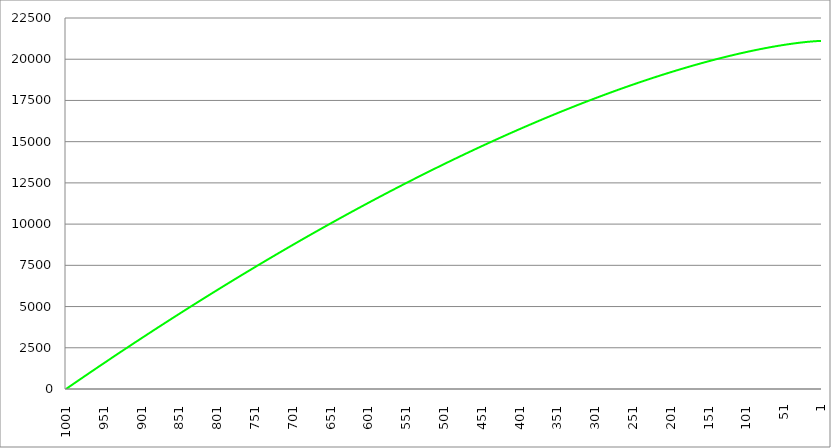
| Category | Series 1 | Series 0 | Series 2 |
|---|---|---|---|
| 1001.0 |  | 0 |  |
| 1000.5 |  | 15.817 |  |
| 1000.0 |  | 31.631 |  |
| 999.5 |  | 47.44 |  |
| 999.0 |  | 63.246 |  |
| 998.5 |  | 79.047 |  |
| 998.0 |  | 94.845 |  |
| 997.5 |  | 110.638 |  |
| 997.0 |  | 126.428 |  |
| 996.5 |  | 142.213 |  |
| 996.0 |  | 157.995 |  |
| 995.5 |  | 173.773 |  |
| 995.0 |  | 189.547 |  |
| 994.5 |  | 205.317 |  |
| 994.0 |  | 221.082 |  |
| 993.5 |  | 236.844 |  |
| 993.0 |  | 252.602 |  |
| 992.5 |  | 268.356 |  |
| 992.0 |  | 284.106 |  |
| 991.5 |  | 299.852 |  |
| 991.0 |  | 315.594 |  |
| 990.5 |  | 331.332 |  |
| 990.0 |  | 347.067 |  |
| 989.5 |  | 362.797 |  |
| 989.0 |  | 378.523 |  |
| 988.5 |  | 394.245 |  |
| 988.0 |  | 409.963 |  |
| 987.5 |  | 425.678 |  |
| 987.0 |  | 441.388 |  |
| 986.5 |  | 457.094 |  |
| 986.0 |  | 472.796 |  |
| 985.5 |  | 488.495 |  |
| 985.0 |  | 504.189 |  |
| 984.5 |  | 519.879 |  |
| 984.0 |  | 535.566 |  |
| 983.5 |  | 551.248 |  |
| 983.0 |  | 566.927 |  |
| 982.5 |  | 582.601 |  |
| 982.0 |  | 598.271 |  |
| 981.5 |  | 613.938 |  |
| 981.0 |  | 629.6 |  |
| 980.5 |  | 645.259 |  |
| 980.0 |  | 660.913 |  |
| 979.5 |  | 676.564 |  |
| 979.0 |  | 692.21 |  |
| 978.5 |  | 707.853 |  |
| 978.0 |  | 723.491 |  |
| 977.5 |  | 739.126 |  |
| 977.0 |  | 754.756 |  |
| 976.5 |  | 770.383 |  |
| 976.0 |  | 786.005 |  |
| 975.5 |  | 801.624 |  |
| 975.0 |  | 817.238 |  |
| 974.5 |  | 832.849 |  |
| 974.0 |  | 848.455 |  |
| 973.5 |  | 864.058 |  |
| 973.0 |  | 879.656 |  |
| 972.5 |  | 895.251 |  |
| 972.0 |  | 910.841 |  |
| 971.5 |  | 926.428 |  |
| 971.0 |  | 942.01 |  |
| 970.5 |  | 957.588 |  |
| 970.0 |  | 973.163 |  |
| 969.5 |  | 988.733 |  |
| 969.0 |  | 1004.3 |  |
| 968.5 |  | 1019.862 |  |
| 968.0 |  | 1035.42 |  |
| 967.5 |  | 1050.975 |  |
| 967.0 |  | 1066.525 |  |
| 966.5 |  | 1082.071 |  |
| 966.0 |  | 1097.614 |  |
| 965.5 |  | 1113.152 |  |
| 965.0 |  | 1128.686 |  |
| 964.5 |  | 1144.216 |  |
| 964.0 |  | 1159.743 |  |
| 963.5 |  | 1175.265 |  |
| 963.0 |  | 1190.783 |  |
| 962.5 |  | 1206.297 |  |
| 962.0 |  | 1221.807 |  |
| 961.5 |  | 1237.313 |  |
| 961.0 |  | 1252.815 |  |
| 960.5 |  | 1268.313 |  |
| 960.0 |  | 1283.807 |  |
| 959.5 |  | 1299.297 |  |
| 959.0 |  | 1314.783 |  |
| 958.5 |  | 1330.265 |  |
| 958.0 |  | 1345.742 |  |
| 957.5 |  | 1361.216 |  |
| 957.0 |  | 1376.686 |  |
| 956.5 |  | 1392.152 |  |
| 956.0 |  | 1407.613 |  |
| 955.5 |  | 1423.071 |  |
| 955.0 |  | 1438.524 |  |
| 954.5 |  | 1453.974 |  |
| 954.0 |  | 1469.419 |  |
| 953.5 |  | 1484.861 |  |
| 953.0 |  | 1500.298 |  |
| 952.5 |  | 1515.732 |  |
| 952.0 |  | 1531.161 |  |
| 951.5 |  | 1546.586 |  |
| 951.0 |  | 1562.007 |  |
| 950.5 |  | 1577.424 |  |
| 950.0 |  | 1592.837 |  |
| 949.5 |  | 1608.246 |  |
| 949.0 |  | 1623.651 |  |
| 948.5 |  | 1639.052 |  |
| 948.0 |  | 1654.449 |  |
| 947.5 |  | 1669.842 |  |
| 947.0 |  | 1685.231 |  |
| 946.5 |  | 1700.615 |  |
| 946.0 |  | 1715.996 |  |
| 945.5 |  | 1731.372 |  |
| 945.0 |  | 1746.745 |  |
| 944.5 |  | 1762.113 |  |
| 944.0 |  | 1777.478 |  |
| 943.5 |  | 1792.838 |  |
| 943.0 |  | 1808.194 |  |
| 942.5 |  | 1823.546 |  |
| 942.0 |  | 1838.894 |  |
| 941.5 |  | 1854.238 |  |
| 941.0 |  | 1869.578 |  |
| 940.5 |  | 1884.914 |  |
| 940.0 |  | 1900.246 |  |
| 939.5 |  | 1915.573 |  |
| 939.0 |  | 1930.897 |  |
| 938.5 |  | 1946.216 |  |
| 938.0 |  | 1961.532 |  |
| 937.5 |  | 1976.843 |  |
| 937.0 |  | 1992.15 |  |
| 936.5 |  | 2007.454 |  |
| 936.0 |  | 2022.753 |  |
| 935.5 |  | 2038.048 |  |
| 935.0 |  | 2053.339 |  |
| 934.5 |  | 2068.625 |  |
| 934.0 |  | 2083.908 |  |
| 933.5 |  | 2099.187 |  |
| 933.0 |  | 2114.461 |  |
| 932.5 |  | 2129.732 |  |
| 932.0 |  | 2144.998 |  |
| 931.5 |  | 2160.261 |  |
| 931.0 |  | 2175.519 |  |
| 930.5 |  | 2190.773 |  |
| 930.0 |  | 2206.023 |  |
| 929.5 |  | 2221.269 |  |
| 929.0 |  | 2236.511 |  |
| 928.5 |  | 2251.748 |  |
| 928.0 |  | 2266.982 |  |
| 927.5 |  | 2282.211 |  |
| 927.0 |  | 2297.437 |  |
| 926.5 |  | 2312.658 |  |
| 926.0 |  | 2327.875 |  |
| 925.5 |  | 2343.088 |  |
| 925.0 |  | 2358.297 |  |
| 924.5 |  | 2373.502 |  |
| 924.0 |  | 2388.703 |  |
| 923.5 |  | 2403.899 |  |
| 923.0 |  | 2419.092 |  |
| 922.5 |  | 2434.28 |  |
| 922.0 |  | 2449.465 |  |
| 921.5 |  | 2464.645 |  |
| 921.0 |  | 2479.821 |  |
| 920.5 |  | 2494.993 |  |
| 920.0 |  | 2510.161 |  |
| 919.5 |  | 2525.324 |  |
| 919.0 |  | 2540.484 |  |
| 918.5 |  | 2555.639 |  |
| 918.0 |  | 2570.791 |  |
| 917.5 |  | 2585.938 |  |
| 917.0 |  | 2601.081 |  |
| 916.5 |  | 2616.22 |  |
| 916.0 |  | 2631.355 |  |
| 915.5 |  | 2646.485 |  |
| 915.0 |  | 2661.612 |  |
| 914.5 |  | 2676.734 |  |
| 914.0 |  | 2691.853 |  |
| 913.5 |  | 2706.967 |  |
| 913.0 |  | 2722.077 |  |
| 912.5 |  | 2737.183 |  |
| 912.0 |  | 2752.284 |  |
| 911.5 |  | 2767.382 |  |
| 911.0 |  | 2782.475 |  |
| 910.5 |  | 2797.565 |  |
| 910.0 |  | 2812.65 |  |
| 909.5 |  | 2827.731 |  |
| 909.0 |  | 2842.808 |  |
| 908.5 |  | 2857.881 |  |
| 908.0 |  | 2872.949 |  |
| 907.5 |  | 2888.014 |  |
| 907.0 |  | 2903.074 |  |
| 906.5 |  | 2918.13 |  |
| 906.0 |  | 2933.182 |  |
| 905.5 |  | 2948.23 |  |
| 905.0 |  | 2963.274 |  |
| 904.5 |  | 2978.313 |  |
| 904.0 |  | 2993.349 |  |
| 903.5 |  | 3008.38 |  |
| 903.0 |  | 3023.407 |  |
| 902.5 |  | 3038.43 |  |
| 902.0 |  | 3053.448 |  |
| 901.5 |  | 3068.463 |  |
| 901.0 |  | 3083.473 |  |
| 900.5 |  | 3098.48 |  |
| 900.0 |  | 3113.482 |  |
| 899.5 |  | 3128.48 |  |
| 899.0 |  | 3143.473 |  |
| 898.5 |  | 3158.463 |  |
| 898.0 |  | 3173.448 |  |
| 897.5 |  | 3188.43 |  |
| 897.0 |  | 3203.407 |  |
| 896.5 |  | 3218.38 |  |
| 896.0 |  | 3233.348 |  |
| 895.5 |  | 3248.313 |  |
| 895.0 |  | 3263.273 |  |
| 894.5 |  | 3278.229 |  |
| 894.0 |  | 3293.181 |  |
| 893.5 |  | 3308.129 |  |
| 893.0 |  | 3323.073 |  |
| 892.5 |  | 3338.012 |  |
| 892.0 |  | 3352.948 |  |
| 891.5 |  | 3367.879 |  |
| 891.0 |  | 3382.806 |  |
| 890.5 |  | 3397.728 |  |
| 890.0 |  | 3412.647 |  |
| 889.5 |  | 3427.561 |  |
| 889.0 |  | 3442.471 |  |
| 888.5 |  | 3457.377 |  |
| 888.0 |  | 3472.279 |  |
| 887.5 |  | 3487.177 |  |
| 887.0 |  | 3502.07 |  |
| 886.5 |  | 3516.959 |  |
| 886.0 |  | 3531.844 |  |
| 885.5 |  | 3546.725 |  |
| 885.0 |  | 3561.602 |  |
| 884.5 |  | 3576.474 |  |
| 884.0 |  | 3591.342 |  |
| 883.5 |  | 3606.206 |  |
| 883.0 |  | 3621.066 |  |
| 882.5 |  | 3635.921 |  |
| 882.0 |  | 3650.773 |  |
| 881.5 |  | 3665.62 |  |
| 881.0 |  | 3680.463 |  |
| 880.5 |  | 3695.301 |  |
| 880.0 |  | 3710.136 |  |
| 879.5 |  | 3724.966 |  |
| 879.0 |  | 3739.792 |  |
| 878.5 |  | 3754.614 |  |
| 878.0 |  | 3769.432 |  |
| 877.5 |  | 3784.245 |  |
| 877.0 |  | 3799.054 |  |
| 876.5 |  | 3813.859 |  |
| 876.0 |  | 3828.66 |  |
| 875.5 |  | 3843.457 |  |
| 875.0 |  | 3858.249 |  |
| 874.5 |  | 3873.037 |  |
| 874.0 |  | 3887.821 |  |
| 873.5 |  | 3902.601 |  |
| 873.0 |  | 3917.376 |  |
| 872.5 |  | 3932.147 |  |
| 872.0 |  | 3946.914 |  |
| 871.5 |  | 3961.677 |  |
| 871.0 |  | 3976.435 |  |
| 870.5 |  | 3991.19 |  |
| 870.0 |  | 4005.94 |  |
| 869.5 |  | 4020.685 |  |
| 869.0 |  | 4035.427 |  |
| 868.5 |  | 4050.164 |  |
| 868.0 |  | 4064.897 |  |
| 867.5 |  | 4079.626 |  |
| 867.0 |  | 4094.351 |  |
| 866.5 |  | 4109.071 |  |
| 866.0 |  | 4123.787 |  |
| 865.5 |  | 4138.499 |  |
| 865.0 |  | 4153.206 |  |
| 864.5 |  | 4167.91 |  |
| 864.0 |  | 4182.609 |  |
| 863.5 |  | 4197.303 |  |
| 863.0 |  | 4211.994 |  |
| 862.5 |  | 4226.68 |  |
| 862.0 |  | 4241.362 |  |
| 861.5 |  | 4256.04 |  |
| 861.0 |  | 4270.714 |  |
| 860.5 |  | 4285.383 |  |
| 860.0 |  | 4300.048 |  |
| 859.5 |  | 4314.709 |  |
| 859.0 |  | 4329.365 |  |
| 858.5 |  | 4344.017 |  |
| 858.0 |  | 4358.665 |  |
| 857.5 |  | 4373.309 |  |
| 857.0 |  | 4387.948 |  |
| 856.5 |  | 4402.584 |  |
| 856.0 |  | 4417.214 |  |
| 855.5 |  | 4431.841 |  |
| 855.0 |  | 4446.463 |  |
| 854.5 |  | 4461.081 |  |
| 854.0 |  | 4475.695 |  |
| 853.5 |  | 4490.305 |  |
| 853.0 |  | 4504.91 |  |
| 852.5 |  | 4519.511 |  |
| 852.0 |  | 4534.108 |  |
| 851.5 |  | 4548.7 |  |
| 851.0 |  | 4563.288 |  |
| 850.5 |  | 4577.872 |  |
| 850.0 |  | 4592.451 |  |
| 849.5 |  | 4607.027 |  |
| 849.0 |  | 4621.598 |  |
| 848.5 |  | 4636.164 |  |
| 848.0 |  | 4650.727 |  |
| 847.5 |  | 4665.285 |  |
| 847.0 |  | 4679.838 |  |
| 846.5 |  | 4694.388 |  |
| 846.0 |  | 4708.933 |  |
| 845.5 |  | 4723.474 |  |
| 845.0 |  | 4738.011 |  |
| 844.5 |  | 4752.543 |  |
| 844.0 |  | 4767.071 |  |
| 843.5 |  | 4781.595 |  |
| 843.0 |  | 4796.114 |  |
| 842.5 |  | 4810.629 |  |
| 842.0 |  | 4825.14 |  |
| 841.5 |  | 4839.646 |  |
| 841.0 |  | 4854.148 |  |
| 840.5 |  | 4868.646 |  |
| 840.0 |  | 4883.14 |  |
| 839.5 |  | 4897.629 |  |
| 839.0 |  | 4912.114 |  |
| 838.5 |  | 4926.595 |  |
| 838.0 |  | 4941.071 |  |
| 837.5 |  | 4955.543 |  |
| 837.0 |  | 4970.01 |  |
| 836.5 |  | 4984.474 |  |
| 836.0 |  | 4998.933 |  |
| 835.5 |  | 5013.387 |  |
| 835.0 |  | 5027.838 |  |
| 834.5 |  | 5042.284 |  |
| 834.0 |  | 5056.725 |  |
| 833.5 |  | 5071.163 |  |
| 833.0 |  | 5085.596 |  |
| 832.5 |  | 5100.025 |  |
| 832.0 |  | 5114.449 |  |
| 831.5 |  | 5128.869 |  |
| 831.0 |  | 5143.285 |  |
| 830.5 |  | 5157.696 |  |
| 830.0 |  | 5172.103 |  |
| 829.5 |  | 5186.506 |  |
| 829.0 |  | 5200.904 |  |
| 828.5 |  | 5215.298 |  |
| 828.0 |  | 5229.688 |  |
| 827.5 |  | 5244.073 |  |
| 827.0 |  | 5258.454 |  |
| 826.5 |  | 5272.831 |  |
| 826.0 |  | 5287.203 |  |
| 825.5 |  | 5301.571 |  |
| 825.0 |  | 5315.934 |  |
| 824.5 |  | 5330.294 |  |
| 824.0 |  | 5344.649 |  |
| 823.5 |  | 5358.999 |  |
| 823.0 |  | 5373.345 |  |
| 822.5 |  | 5387.687 |  |
| 822.0 |  | 5402.025 |  |
| 821.5 |  | 5416.358 |  |
| 821.0 |  | 5430.686 |  |
| 820.5 |  | 5445.011 |  |
| 820.0 |  | 5459.331 |  |
| 819.5 |  | 5473.646 |  |
| 819.0 |  | 5487.958 |  |
| 818.5 |  | 5502.265 |  |
| 818.0 |  | 5516.567 |  |
| 817.5 |  | 5530.865 |  |
| 817.0 |  | 5545.159 |  |
| 816.5 |  | 5559.448 |  |
| 816.0 |  | 5573.733 |  |
| 815.5 |  | 5588.014 |  |
| 815.0 |  | 5602.29 |  |
| 814.5 |  | 5616.562 |  |
| 814.0 |  | 5630.83 |  |
| 813.5 |  | 5645.093 |  |
| 813.0 |  | 5659.352 |  |
| 812.5 |  | 5673.606 |  |
| 812.0 |  | 5687.856 |  |
| 811.5 |  | 5702.102 |  |
| 811.0 |  | 5716.343 |  |
| 810.5 |  | 5730.58 |  |
| 810.0 |  | 5744.812 |  |
| 809.5 |  | 5759.04 |  |
| 809.0 |  | 5773.264 |  |
| 808.5 |  | 5787.483 |  |
| 808.0 |  | 5801.698 |  |
| 807.5 |  | 5815.909 |  |
| 807.0 |  | 5830.115 |  |
| 806.5 |  | 5844.316 |  |
| 806.0 |  | 5858.514 |  |
| 805.5 |  | 5872.707 |  |
| 805.0 |  | 5886.895 |  |
| 804.5 |  | 5901.079 |  |
| 804.0 |  | 5915.259 |  |
| 803.5 |  | 5929.434 |  |
| 803.0 |  | 5943.605 |  |
| 802.5 |  | 5957.771 |  |
| 802.0 |  | 5971.933 |  |
| 801.5 |  | 5986.091 |  |
| 801.0 |  | 6000.244 |  |
| 800.5 |  | 6014.393 |  |
| 800.0 |  | 6028.537 |  |
| 799.5 |  | 6042.677 |  |
| 799.0 |  | 6056.813 |  |
| 798.5 |  | 6070.944 |  |
| 798.0 |  | 6085.07 |  |
| 797.5 |  | 6099.192 |  |
| 797.0 |  | 6113.31 |  |
| 796.5 |  | 6127.424 |  |
| 796.0 |  | 6141.533 |  |
| 795.5 |  | 6155.637 |  |
| 795.0 |  | 6169.737 |  |
| 794.5 |  | 6183.833 |  |
| 794.0 |  | 6197.924 |  |
| 793.5 |  | 6212.011 |  |
| 793.0 |  | 6226.093 |  |
| 792.5 |  | 6240.171 |  |
| 792.0 |  | 6254.245 |  |
| 791.5 |  | 6268.314 |  |
| 791.0 |  | 6282.378 |  |
| 790.5 |  | 6296.438 |  |
| 790.0 |  | 6310.494 |  |
| 789.5 |  | 6324.545 |  |
| 789.0 |  | 6338.592 |  |
| 788.5 |  | 6352.634 |  |
| 788.0 |  | 6366.672 |  |
| 787.5 |  | 6380.706 |  |
| 787.0 |  | 6394.735 |  |
| 786.5 |  | 6408.759 |  |
| 786.0 |  | 6422.779 |  |
| 785.5 |  | 6436.795 |  |
| 785.0 |  | 6450.806 |  |
| 784.5 |  | 6464.813 |  |
| 784.0 |  | 6478.815 |  |
| 783.5 |  | 6492.813 |  |
| 783.0 |  | 6506.806 |  |
| 782.5 |  | 6520.795 |  |
| 782.0 |  | 6534.779 |  |
| 781.5 |  | 6548.759 |  |
| 781.0 |  | 6562.735 |  |
| 780.5 |  | 6576.706 |  |
| 780.0 |  | 6590.672 |  |
| 779.5 |  | 6604.634 |  |
| 779.0 |  | 6618.592 |  |
| 778.5 |  | 6632.545 |  |
| 778.0 |  | 6646.493 |  |
| 777.5 |  | 6660.437 |  |
| 777.0 |  | 6674.377 |  |
| 776.5 |  | 6688.312 |  |
| 776.0 |  | 6702.243 |  |
| 775.5 |  | 6716.169 |  |
| 775.0 |  | 6730.09 |  |
| 774.5 |  | 6744.008 |  |
| 774.0 |  | 6757.92 |  |
| 773.5 |  | 6771.828 |  |
| 773.0 |  | 6785.732 |  |
| 772.5 |  | 6799.631 |  |
| 772.0 |  | 6813.526 |  |
| 771.5 |  | 6827.416 |  |
| 771.0 |  | 6841.302 |  |
| 770.5 |  | 6855.183 |  |
| 770.0 |  | 6869.06 |  |
| 769.5 |  | 6882.932 |  |
| 769.0 |  | 6896.8 |  |
| 768.5 |  | 6910.663 |  |
| 768.0 |  | 6924.522 |  |
| 767.5 |  | 6938.376 |  |
| 767.0 |  | 6952.225 |  |
| 766.5 |  | 6966.07 |  |
| 766.0 |  | 6979.911 |  |
| 765.5 |  | 6993.747 |  |
| 765.0 |  | 7007.579 |  |
| 764.5 |  | 7021.406 |  |
| 764.0 |  | 7035.228 |  |
| 763.5 |  | 7049.046 |  |
| 763.0 |  | 7062.86 |  |
| 762.5 |  | 7076.669 |  |
| 762.0 |  | 7090.473 |  |
| 761.5 |  | 7104.273 |  |
| 761.0 |  | 7118.069 |  |
| 760.5 |  | 7131.859 |  |
| 760.0 |  | 7145.646 |  |
| 759.5 |  | 7159.427 |  |
| 759.0 |  | 7173.205 |  |
| 758.5 |  | 7186.977 |  |
| 758.0 |  | 7200.746 |  |
| 757.5 |  | 7214.509 |  |
| 757.0 |  | 7228.268 |  |
| 756.5 |  | 7242.023 |  |
| 756.0 |  | 7255.773 |  |
| 755.5 |  | 7269.518 |  |
| 755.0 |  | 7283.259 |  |
| 754.5 |  | 7296.996 |  |
| 754.0 |  | 7310.727 |  |
| 753.5 |  | 7324.455 |  |
| 753.0 |  | 7338.177 |  |
| 752.5 |  | 7351.895 |  |
| 752.0 |  | 7365.609 |  |
| 751.5 |  | 7379.318 |  |
| 751.0 |  | 7393.023 |  |
| 750.5 |  | 7406.722 |  |
| 750.0 |  | 7420.418 |  |
| 749.5 |  | 7434.109 |  |
| 749.0 |  | 7447.795 |  |
| 748.5 |  | 7461.476 |  |
| 748.0 |  | 7475.154 |  |
| 747.5 |  | 7488.826 |  |
| 747.0 |  | 7502.494 |  |
| 746.5 |  | 7516.157 |  |
| 746.0 |  | 7529.816 |  |
| 745.5 |  | 7543.47 |  |
| 745.0 |  | 7557.12 |  |
| 744.5 |  | 7570.765 |  |
| 744.0 |  | 7584.406 |  |
| 743.5 |  | 7598.041 |  |
| 743.0 |  | 7611.673 |  |
| 742.5 |  | 7625.299 |  |
| 742.0 |  | 7638.922 |  |
| 741.5 |  | 7652.539 |  |
| 741.0 |  | 7666.152 |  |
| 740.5 |  | 7679.76 |  |
| 740.0 |  | 7693.364 |  |
| 739.5 |  | 7706.963 |  |
| 739.0 |  | 7720.558 |  |
| 738.5 |  | 7734.148 |  |
| 738.0 |  | 7747.733 |  |
| 737.5 |  | 7761.314 |  |
| 737.0 |  | 7774.89 |  |
| 736.5 |  | 7788.462 |  |
| 736.0 |  | 7802.029 |  |
| 735.5 |  | 7815.591 |  |
| 735.0 |  | 7829.149 |  |
| 734.5 |  | 7842.702 |  |
| 734.0 |  | 7856.251 |  |
| 733.5 |  | 7869.794 |  |
| 733.0 |  | 7883.334 |  |
| 732.5 |  | 7896.868 |  |
| 732.0 |  | 7910.398 |  |
| 731.5 |  | 7923.924 |  |
| 731.0 |  | 7937.445 |  |
| 730.5 |  | 7950.961 |  |
| 730.0 |  | 7964.472 |  |
| 729.5 |  | 7977.979 |  |
| 729.0 |  | 7991.482 |  |
| 728.5 |  | 8004.979 |  |
| 728.0 |  | 8018.472 |  |
| 727.5 |  | 8031.961 |  |
| 727.0 |  | 8045.445 |  |
| 726.5 |  | 8058.924 |  |
| 726.0 |  | 8072.398 |  |
| 725.5 |  | 8085.868 |  |
| 725.0 |  | 8099.333 |  |
| 724.5 |  | 8112.794 |  |
| 724.0 |  | 8126.25 |  |
| 723.5 |  | 8139.701 |  |
| 723.0 |  | 8153.148 |  |
| 722.5 |  | 8166.59 |  |
| 722.0 |  | 8180.027 |  |
| 721.5 |  | 8193.46 |  |
| 721.0 |  | 8206.888 |  |
| 720.5 |  | 8220.311 |  |
| 720.0 |  | 8233.73 |  |
| 719.5 |  | 8247.144 |  |
| 719.0 |  | 8260.554 |  |
| 718.5 |  | 8273.958 |  |
| 718.0 |  | 8287.359 |  |
| 717.5 |  | 8300.754 |  |
| 717.0 |  | 8314.145 |  |
| 716.5 |  | 8327.531 |  |
| 716.0 |  | 8340.912 |  |
| 715.5 |  | 8354.289 |  |
| 715.0 |  | 8367.661 |  |
| 714.5 |  | 8381.028 |  |
| 714.0 |  | 8394.391 |  |
| 713.5 |  | 8407.749 |  |
| 713.0 |  | 8421.103 |  |
| 712.5 |  | 8434.451 |  |
| 712.0 |  | 8447.795 |  |
| 711.5 |  | 8461.135 |  |
| 711.0 |  | 8474.469 |  |
| 710.5 |  | 8487.799 |  |
| 710.0 |  | 8501.124 |  |
| 709.5 |  | 8514.445 |  |
| 709.0 |  | 8527.761 |  |
| 708.5 |  | 8541.072 |  |
| 708.0 |  | 8554.379 |  |
| 707.5 |  | 8567.68 |  |
| 707.0 |  | 8580.977 |  |
| 706.5 |  | 8594.27 |  |
| 706.0 |  | 8607.558 |  |
| 705.5 |  | 8620.841 |  |
| 705.0 |  | 8634.119 |  |
| 704.5 |  | 8647.392 |  |
| 704.0 |  | 8660.661 |  |
| 703.5 |  | 8673.925 |  |
| 703.0 |  | 8687.185 |  |
| 702.5 |  | 8700.439 |  |
| 702.0 |  | 8713.689 |  |
| 701.5 |  | 8726.935 |  |
| 701.0 |  | 8740.175 |  |
| 700.5 |  | 8753.411 |  |
| 700.0 |  | 8766.642 |  |
| 699.5 |  | 8779.869 |  |
| 699.0 |  | 8793.09 |  |
| 698.5 |  | 8806.307 |  |
| 698.0 |  | 8819.52 |  |
| 697.5 |  | 8832.727 |  |
| 697.0 |  | 8845.93 |  |
| 696.5 |  | 8859.128 |  |
| 696.0 |  | 8872.321 |  |
| 695.5 |  | 8885.51 |  |
| 695.0 |  | 8898.693 |  |
| 694.5 |  | 8911.872 |  |
| 694.0 |  | 8925.047 |  |
| 693.5 |  | 8938.216 |  |
| 693.0 |  | 8951.381 |  |
| 692.5 |  | 8964.541 |  |
| 692.0 |  | 8977.697 |  |
| 691.5 |  | 8990.847 |  |
| 691.0 |  | 9003.993 |  |
| 690.5 |  | 9017.134 |  |
| 690.0 |  | 9030.27 |  |
| 689.5 |  | 9043.402 |  |
| 689.0 |  | 9056.529 |  |
| 688.5 |  | 9069.651 |  |
| 688.0 |  | 9082.768 |  |
| 687.5 |  | 9095.88 |  |
| 687.0 |  | 9108.988 |  |
| 686.5 |  | 9122.091 |  |
| 686.0 |  | 9135.189 |  |
| 685.5 |  | 9148.283 |  |
| 685.0 |  | 9161.371 |  |
| 684.5 |  | 9174.455 |  |
| 684.0 |  | 9187.534 |  |
| 683.5 |  | 9200.609 |  |
| 683.0 |  | 9213.678 |  |
| 682.5 |  | 9226.743 |  |
| 682.0 |  | 9239.803 |  |
| 681.5 |  | 9252.858 |  |
| 681.0 |  | 9265.908 |  |
| 680.5 |  | 9278.954 |  |
| 680.0 |  | 9291.995 |  |
| 679.5 |  | 9305.031 |  |
| 679.0 |  | 9318.062 |  |
| 678.5 |  | 9331.088 |  |
| 678.0 |  | 9344.11 |  |
| 677.5 |  | 9357.127 |  |
| 677.0 |  | 9370.139 |  |
| 676.5 |  | 9383.146 |  |
| 676.0 |  | 9396.148 |  |
| 675.5 |  | 9409.146 |  |
| 675.0 |  | 9422.139 |  |
| 674.5 |  | 9435.127 |  |
| 674.0 |  | 9448.11 |  |
| 673.5 |  | 9461.088 |  |
| 673.0 |  | 9474.062 |  |
| 672.5 |  | 9487.031 |  |
| 672.0 |  | 9499.994 |  |
| 671.5 |  | 9512.953 |  |
| 671.0 |  | 9525.908 |  |
| 670.5 |  | 9538.857 |  |
| 670.0 |  | 9551.802 |  |
| 669.5 |  | 9564.742 |  |
| 669.0 |  | 9577.676 |  |
| 668.5 |  | 9590.607 |  |
| 668.0 |  | 9603.532 |  |
| 667.5 |  | 9616.452 |  |
| 667.0 |  | 9629.368 |  |
| 666.5 |  | 9642.279 |  |
| 666.0 |  | 9655.184 |  |
| 665.5 |  | 9668.086 |  |
| 665.0 |  | 9680.982 |  |
| 664.5 |  | 9693.873 |  |
| 664.0 |  | 9706.76 |  |
| 663.5 |  | 9719.641 |  |
| 663.0 |  | 9732.518 |  |
| 662.5 |  | 9745.39 |  |
| 662.0 |  | 9758.257 |  |
| 661.5 |  | 9771.119 |  |
| 661.0 |  | 9783.977 |  |
| 660.5 |  | 9796.829 |  |
| 660.0 |  | 9809.677 |  |
| 659.5 |  | 9822.52 |  |
| 659.0 |  | 9835.358 |  |
| 658.5 |  | 9848.191 |  |
| 658.0 |  | 9861.019 |  |
| 657.5 |  | 9873.842 |  |
| 657.0 |  | 9886.661 |  |
| 656.5 |  | 9899.474 |  |
| 656.0 |  | 9912.283 |  |
| 655.5 |  | 9925.087 |  |
| 655.0 |  | 9937.886 |  |
| 654.5 |  | 9950.68 |  |
| 654.0 |  | 9963.469 |  |
| 653.5 |  | 9976.253 |  |
| 653.0 |  | 9989.033 |  |
| 652.5 |  | 10001.807 |  |
| 652.0 |  | 10014.577 |  |
| 651.5 |  | 10027.341 |  |
| 651.0 |  | 10040.101 |  |
| 650.5 |  | 10052.856 |  |
| 650.0 |  | 10065.606 |  |
| 649.5 |  | 10078.351 |  |
| 649.0 |  | 10091.091 |  |
| 648.5 |  | 10103.827 |  |
| 648.0 |  | 10116.557 |  |
| 647.5 |  | 10129.283 |  |
| 647.0 |  | 10142.003 |  |
| 646.5 |  | 10154.719 |  |
| 646.0 |  | 10167.429 |  |
| 645.5 |  | 10180.135 |  |
| 645.0 |  | 10192.836 |  |
| 644.5 |  | 10205.532 |  |
| 644.0 |  | 10218.223 |  |
| 643.5 |  | 10230.909 |  |
| 643.0 |  | 10243.59 |  |
| 642.5 |  | 10256.267 |  |
| 642.0 |  | 10268.938 |  |
| 641.5 |  | 10281.604 |  |
| 641.0 |  | 10294.266 |  |
| 640.5 |  | 10306.922 |  |
| 640.0 |  | 10319.574 |  |
| 639.5 |  | 10332.221 |  |
| 639.0 |  | 10344.862 |  |
| 638.5 |  | 10357.499 |  |
| 638.0 |  | 10370.131 |  |
| 637.5 |  | 10382.758 |  |
| 637.0 |  | 10395.38 |  |
| 636.5 |  | 10407.997 |  |
| 636.0 |  | 10420.609 |  |
| 635.5 |  | 10433.216 |  |
| 635.0 |  | 10445.818 |  |
| 634.5 |  | 10458.415 |  |
| 634.0 |  | 10471.007 |  |
| 633.5 |  | 10483.594 |  |
| 633.0 |  | 10496.176 |  |
| 632.5 |  | 10508.754 |  |
| 632.0 |  | 10521.326 |  |
| 631.5 |  | 10533.893 |  |
| 631.0 |  | 10546.456 |  |
| 630.5 |  | 10559.013 |  |
| 630.0 |  | 10571.565 |  |
| 629.5 |  | 10584.113 |  |
| 629.0 |  | 10596.655 |  |
| 628.5 |  | 10609.193 |  |
| 628.0 |  | 10621.725 |  |
| 627.5 |  | 10634.253 |  |
| 627.0 |  | 10646.775 |  |
| 626.5 |  | 10659.293 |  |
| 626.0 |  | 10671.805 |  |
| 625.5 |  | 10684.313 |  |
| 625.0 |  | 10696.815 |  |
| 624.5 |  | 10709.313 |  |
| 624.0 |  | 10721.805 |  |
| 623.5 |  | 10734.293 |  |
| 623.0 |  | 10746.775 |  |
| 622.5 |  | 10759.253 |  |
| 622.0 |  | 10771.725 |  |
| 621.5 |  | 10784.192 |  |
| 621.0 |  | 10796.655 |  |
| 620.5 |  | 10809.112 |  |
| 620.0 |  | 10821.565 |  |
| 619.5 |  | 10834.012 |  |
| 619.0 |  | 10846.455 |  |
| 618.5 |  | 10858.892 |  |
| 618.0 |  | 10871.324 |  |
| 617.5 |  | 10883.751 |  |
| 617.0 |  | 10896.174 |  |
| 616.5 |  | 10908.591 |  |
| 616.0 |  | 10921.003 |  |
| 615.5 |  | 10933.41 |  |
| 615.0 |  | 10945.812 |  |
| 614.5 |  | 10958.209 |  |
| 614.0 |  | 10970.602 |  |
| 613.5 |  | 10982.988 |  |
| 613.0 |  | 10995.37 |  |
| 612.5 |  | 11007.747 |  |
| 612.0 |  | 11020.119 |  |
| 611.5 |  | 11032.486 |  |
| 611.0 |  | 11044.848 |  |
| 610.5 |  | 11057.204 |  |
| 610.0 |  | 11069.556 |  |
| 609.5 |  | 11081.903 |  |
| 609.0 |  | 11094.244 |  |
| 608.5 |  | 11106.58 |  |
| 608.0 |  | 11118.912 |  |
| 607.5 |  | 11131.238 |  |
| 607.0 |  | 11143.559 |  |
| 606.5 |  | 11155.876 |  |
| 606.0 |  | 11168.187 |  |
| 605.5 |  | 11180.493 |  |
| 605.0 |  | 11192.793 |  |
| 604.5 |  | 11205.089 |  |
| 604.0 |  | 11217.38 |  |
| 603.5 |  | 11229.666 |  |
| 603.0 |  | 11241.946 |  |
| 602.5 |  | 11254.222 |  |
| 602.0 |  | 11266.492 |  |
| 601.5 |  | 11278.757 |  |
| 601.0 |  | 11291.018 |  |
| 600.5 |  | 11303.273 |  |
| 600.0 |  | 11315.523 |  |
| 599.5 |  | 11327.768 |  |
| 599.0 |  | 11340.007 |  |
| 598.5 |  | 11352.242 |  |
| 598.0 |  | 11364.472 |  |
| 597.5 |  | 11376.696 |  |
| 597.0 |  | 11388.916 |  |
| 596.5 |  | 11401.13 |  |
| 596.0 |  | 11413.339 |  |
| 595.5 |  | 11425.543 |  |
| 595.0 |  | 11437.742 |  |
| 594.5 |  | 11449.936 |  |
| 594.0 |  | 11462.124 |  |
| 593.5 |  | 11474.308 |  |
| 593.0 |  | 11486.486 |  |
| 592.5 |  | 11498.659 |  |
| 592.0 |  | 11510.827 |  |
| 591.5 |  | 11522.99 |  |
| 591.0 |  | 11535.148 |  |
| 590.5 |  | 11547.301 |  |
| 590.0 |  | 11559.448 |  |
| 589.5 |  | 11571.591 |  |
| 589.0 |  | 11583.728 |  |
| 588.5 |  | 11595.86 |  |
| 588.0 |  | 11607.987 |  |
| 587.5 |  | 11620.109 |  |
| 587.0 |  | 11632.225 |  |
| 586.5 |  | 11644.337 |  |
| 586.0 |  | 11656.443 |  |
| 585.5 |  | 11668.544 |  |
| 585.0 |  | 11680.64 |  |
| 584.5 |  | 11692.731 |  |
| 584.0 |  | 11704.817 |  |
| 583.5 |  | 11716.897 |  |
| 583.0 |  | 11728.972 |  |
| 582.5 |  | 11741.042 |  |
| 582.0 |  | 11753.107 |  |
| 581.5 |  | 11765.167 |  |
| 581.0 |  | 11777.222 |  |
| 580.5 |  | 11789.271 |  |
| 580.0 |  | 11801.315 |  |
| 579.5 |  | 11813.354 |  |
| 579.0 |  | 11825.388 |  |
| 578.5 |  | 11837.417 |  |
| 578.0 |  | 11849.44 |  |
| 577.5 |  | 11861.458 |  |
| 577.0 |  | 11873.471 |  |
| 576.5 |  | 11885.479 |  |
| 576.0 |  | 11897.482 |  |
| 575.5 |  | 11909.479 |  |
| 575.0 |  | 11921.471 |  |
| 574.5 |  | 11933.458 |  |
| 574.0 |  | 11945.44 |  |
| 573.5 |  | 11957.417 |  |
| 573.0 |  | 11969.388 |  |
| 572.5 |  | 11981.354 |  |
| 572.0 |  | 11993.315 |  |
| 571.5 |  | 12005.271 |  |
| 571.0 |  | 12017.221 |  |
| 570.5 |  | 12029.166 |  |
| 570.0 |  | 12041.106 |  |
| 569.5 |  | 12053.041 |  |
| 569.0 |  | 12064.97 |  |
| 568.5 |  | 12076.895 |  |
| 568.0 |  | 12088.814 |  |
| 567.5 |  | 12100.727 |  |
| 567.0 |  | 12112.636 |  |
| 566.5 |  | 12124.539 |  |
| 566.0 |  | 12136.437 |  |
| 565.5 |  | 12148.33 |  |
| 565.0 |  | 12160.217 |  |
| 564.5 |  | 12172.1 |  |
| 564.0 |  | 12183.976 |  |
| 563.5 |  | 12195.848 |  |
| 563.0 |  | 12207.715 |  |
| 562.5 |  | 12219.576 |  |
| 562.0 |  | 12231.432 |  |
| 561.5 |  | 12243.282 |  |
| 561.0 |  | 12255.128 |  |
| 560.5 |  | 12266.968 |  |
| 560.0 |  | 12278.803 |  |
| 559.5 |  | 12290.632 |  |
| 559.0 |  | 12302.456 |  |
| 558.5 |  | 12314.275 |  |
| 558.0 |  | 12326.089 |  |
| 557.5 |  | 12337.897 |  |
| 557.0 |  | 12349.7 |  |
| 556.5 |  | 12361.498 |  |
| 556.0 |  | 12373.291 |  |
| 555.5 |  | 12385.078 |  |
| 555.0 |  | 12396.86 |  |
| 554.5 |  | 12408.636 |  |
| 554.0 |  | 12420.408 |  |
| 553.5 |  | 12432.173 |  |
| 553.0 |  | 12443.934 |  |
| 552.5 |  | 12455.689 |  |
| 552.0 |  | 12467.439 |  |
| 551.5 |  | 12479.184 |  |
| 551.0 |  | 12490.923 |  |
| 550.5 |  | 12502.657 |  |
| 550.0 |  | 12514.386 |  |
| 549.5 |  | 12526.11 |  |
| 549.0 |  | 12537.828 |  |
| 548.5 |  | 12549.54 |  |
| 548.0 |  | 12561.248 |  |
| 547.5 |  | 12572.95 |  |
| 547.0 |  | 12584.646 |  |
| 546.5 |  | 12596.338 |  |
| 546.0 |  | 12608.024 |  |
| 545.5 |  | 12619.704 |  |
| 545.0 |  | 12631.38 |  |
| 544.5 |  | 12643.05 |  |
| 544.0 |  | 12654.714 |  |
| 543.5 |  | 12666.373 |  |
| 543.0 |  | 12678.027 |  |
| 542.5 |  | 12689.676 |  |
| 542.0 |  | 12701.319 |  |
| 541.5 |  | 12712.957 |  |
| 541.0 |  | 12724.589 |  |
| 540.5 |  | 12736.216 |  |
| 540.0 |  | 12747.838 |  |
| 539.5 |  | 12759.454 |  |
| 539.0 |  | 12771.065 |  |
| 538.5 |  | 12782.67 |  |
| 538.0 |  | 12794.27 |  |
| 537.5 |  | 12805.865 |  |
| 537.0 |  | 12817.455 |  |
| 536.5 |  | 12829.038 |  |
| 536.0 |  | 12840.617 |  |
| 535.5 |  | 12852.19 |  |
| 535.0 |  | 12863.758 |  |
| 534.5 |  | 12875.32 |  |
| 534.0 |  | 12886.877 |  |
| 533.5 |  | 12898.429 |  |
| 533.0 |  | 12909.975 |  |
| 532.5 |  | 12921.515 |  |
| 532.0 |  | 12933.051 |  |
| 531.5 |  | 12944.581 |  |
| 531.0 |  | 12956.105 |  |
| 530.5 |  | 12967.624 |  |
| 530.0 |  | 12979.138 |  |
| 529.5 |  | 12990.646 |  |
| 529.0 |  | 13002.148 |  |
| 528.5 |  | 13013.646 |  |
| 528.0 |  | 13025.138 |  |
| 527.5 |  | 13036.624 |  |
| 527.0 |  | 13048.105 |  |
| 526.5 |  | 13059.58 |  |
| 526.0 |  | 13071.05 |  |
| 525.5 |  | 13082.515 |  |
| 525.0 |  | 13093.974 |  |
| 524.5 |  | 13105.428 |  |
| 524.0 |  | 13116.876 |  |
| 523.5 |  | 13128.319 |  |
| 523.0 |  | 13139.756 |  |
| 522.5 |  | 13151.188 |  |
| 522.0 |  | 13162.615 |  |
| 521.5 |  | 13174.036 |  |
| 521.0 |  | 13185.451 |  |
| 520.5 |  | 13196.861 |  |
| 520.0 |  | 13208.265 |  |
| 519.5 |  | 13219.664 |  |
| 519.0 |  | 13231.058 |  |
| 518.5 |  | 13242.446 |  |
| 518.0 |  | 13253.829 |  |
| 517.5 |  | 13265.206 |  |
| 517.0 |  | 13276.577 |  |
| 516.5 |  | 13287.943 |  |
| 516.0 |  | 13299.304 |  |
| 515.5 |  | 13310.659 |  |
| 515.0 |  | 13322.008 |  |
| 514.5 |  | 13333.353 |  |
| 514.0 |  | 13344.691 |  |
| 513.5 |  | 13356.024 |  |
| 513.0 |  | 13367.352 |  |
| 512.5 |  | 13378.674 |  |
| 512.0 |  | 13389.99 |  |
| 511.5 |  | 13401.301 |  |
| 511.0 |  | 13412.606 |  |
| 510.5 |  | 13423.906 |  |
| 510.0 |  | 13435.201 |  |
| 509.5 |  | 13446.49 |  |
| 509.0 |  | 13457.773 |  |
| 508.5 |  | 13469.051 |  |
| 508.0 |  | 13480.323 |  |
| 507.5 |  | 13491.589 |  |
| 507.0 |  | 13502.851 |  |
| 506.5 |  | 13514.106 |  |
| 506.0 |  | 13525.356 |  |
| 505.5 |  | 13536.6 |  |
| 505.0 |  | 13547.839 |  |
| 504.5 |  | 13559.073 |  |
| 504.0 |  | 13570.3 |  |
| 503.5 |  | 13581.523 |  |
| 503.0 |  | 13592.739 |  |
| 502.5 |  | 13603.95 |  |
| 502.0 |  | 13615.156 |  |
| 501.5 |  | 13626.356 |  |
| 501.0 |  | 13637.55 |  |
| 500.5 |  | 13648.739 |  |
| 500.0 |  | 13659.922 |  |
| 499.5 |  | 13671.099 |  |
| 499.0 |  | 13682.271 |  |
| 498.5 |  | 13693.438 |  |
| 498.0 |  | 13704.598 |  |
| 497.5 |  | 13715.754 |  |
| 497.0 |  | 13726.903 |  |
| 496.5 |  | 13738.047 |  |
| 496.0 |  | 13749.185 |  |
| 495.5 |  | 13760.318 |  |
| 495.0 |  | 13771.445 |  |
| 494.5 |  | 13782.567 |  |
| 494.0 |  | 13793.683 |  |
| 493.5 |  | 13804.793 |  |
| 493.0 |  | 13815.897 |  |
| 492.5 |  | 13826.996 |  |
| 492.0 |  | 13838.09 |  |
| 491.5 |  | 13849.178 |  |
| 491.0 |  | 13860.26 |  |
| 490.5 |  | 13871.336 |  |
| 490.0 |  | 13882.407 |  |
| 489.5 |  | 13893.472 |  |
| 489.0 |  | 13904.531 |  |
| 488.5 |  | 13915.585 |  |
| 488.0 |  | 13926.634 |  |
| 487.5 |  | 13937.676 |  |
| 487.0 |  | 13948.713 |  |
| 486.5 |  | 13959.744 |  |
| 486.0 |  | 13970.77 |  |
| 485.5 |  | 13981.79 |  |
| 485.0 |  | 13992.804 |  |
| 484.5 |  | 14003.812 |  |
| 484.0 |  | 14014.815 |  |
| 483.5 |  | 14025.812 |  |
| 483.0 |  | 14036.804 |  |
| 482.5 |  | 14047.79 |  |
| 482.0 |  | 14058.77 |  |
| 481.5 |  | 14069.744 |  |
| 481.0 |  | 14080.713 |  |
| 480.5 |  | 14091.676 |  |
| 480.0 |  | 14102.633 |  |
| 479.5 |  | 14113.585 |  |
| 479.0 |  | 14124.531 |  |
| 478.5 |  | 14135.471 |  |
| 478.0 |  | 14146.405 |  |
| 477.5 |  | 14157.334 |  |
| 477.0 |  | 14168.257 |  |
| 476.5 |  | 14179.174 |  |
| 476.0 |  | 14190.086 |  |
| 475.5 |  | 14200.992 |  |
| 475.0 |  | 14211.892 |  |
| 474.5 |  | 14222.786 |  |
| 474.0 |  | 14233.675 |  |
| 473.5 |  | 14244.558 |  |
| 473.0 |  | 14255.435 |  |
| 472.5 |  | 14266.306 |  |
| 472.0 |  | 14277.172 |  |
| 471.5 |  | 14288.032 |  |
| 471.0 |  | 14298.886 |  |
| 470.5 |  | 14309.734 |  |
| 470.0 |  | 14320.577 |  |
| 469.5 |  | 14331.414 |  |
| 469.0 |  | 14342.245 |  |
| 468.5 |  | 14353.07 |  |
| 468.0 |  | 14363.89 |  |
| 467.5 |  | 14374.704 |  |
| 467.0 |  | 14385.512 |  |
| 466.5 |  | 14396.314 |  |
| 466.0 |  | 14407.11 |  |
| 465.5 |  | 14417.901 |  |
| 465.0 |  | 14428.686 |  |
| 464.5 |  | 14439.465 |  |
| 464.0 |  | 14450.238 |  |
| 463.5 |  | 14461.005 |  |
| 463.0 |  | 14471.767 |  |
| 462.5 |  | 14482.523 |  |
| 462.0 |  | 14493.273 |  |
| 461.5 |  | 14504.017 |  |
| 461.0 |  | 14514.755 |  |
| 460.5 |  | 14525.488 |  |
| 460.0 |  | 14536.215 |  |
| 459.5 |  | 14546.935 |  |
| 459.0 |  | 14557.65 |  |
| 458.5 |  | 14568.36 |  |
| 458.0 |  | 14579.063 |  |
| 457.5 |  | 14589.761 |  |
| 457.0 |  | 14600.452 |  |
| 456.5 |  | 14611.138 |  |
| 456.0 |  | 14621.818 |  |
| 455.5 |  | 14632.492 |  |
| 455.0 |  | 14643.161 |  |
| 454.5 |  | 14653.823 |  |
| 454.0 |  | 14664.48 |  |
| 453.5 |  | 14675.13 |  |
| 453.0 |  | 14685.775 |  |
| 452.5 |  | 14696.414 |  |
| 452.0 |  | 14707.047 |  |
| 451.5 |  | 14717.674 |  |
| 451.0 |  | 14728.296 |  |
| 450.5 |  | 14738.911 |  |
| 450.0 |  | 14749.521 |  |
| 449.5 |  | 14760.124 |  |
| 449.0 |  | 14770.722 |  |
| 448.5 |  | 14781.314 |  |
| 448.0 |  | 14791.9 |  |
| 447.5 |  | 14802.48 |  |
| 447.0 |  | 14813.054 |  |
| 446.5 |  | 14823.622 |  |
| 446.0 |  | 14834.185 |  |
| 445.5 |  | 14844.741 |  |
| 445.0 |  | 14855.292 |  |
| 444.5 |  | 14865.836 |  |
| 444.0 |  | 14876.375 |  |
| 443.5 |  | 14886.907 |  |
| 443.0 |  | 14897.434 |  |
| 442.5 |  | 14907.955 |  |
| 442.0 |  | 14918.47 |  |
| 441.5 |  | 14928.979 |  |
| 441.0 |  | 14939.482 |  |
| 440.5 |  | 14949.979 |  |
| 440.0 |  | 14960.47 |  |
| 439.5 |  | 14970.955 |  |
| 439.0 |  | 14981.434 |  |
| 438.5 |  | 14991.907 |  |
| 438.0 |  | 15002.374 |  |
| 437.5 |  | 15012.836 |  |
| 437.0 |  | 15023.291 |  |
| 436.5 |  | 15033.74 |  |
| 436.0 |  | 15044.184 |  |
| 435.5 |  | 15054.621 |  |
| 435.0 |  | 15065.052 |  |
| 434.5 |  | 15075.478 |  |
| 434.0 |  | 15085.897 |  |
| 433.5 |  | 15096.31 |  |
| 433.0 |  | 15106.718 |  |
| 432.5 |  | 15117.119 |  |
| 432.0 |  | 15127.514 |  |
| 431.5 |  | 15137.903 |  |
| 431.0 |  | 15148.287 |  |
| 430.5 |  | 15158.664 |  |
| 430.0 |  | 15169.035 |  |
| 429.5 |  | 15179.4 |  |
| 429.0 |  | 15189.76 |  |
| 428.5 |  | 15200.113 |  |
| 428.0 |  | 15210.46 |  |
| 427.5 |  | 15220.801 |  |
| 427.0 |  | 15231.136 |  |
| 426.5 |  | 15241.465 |  |
| 426.0 |  | 15251.788 |  |
| 425.5 |  | 15262.105 |  |
| 425.0 |  | 15272.415 |  |
| 424.5 |  | 15282.72 |  |
| 424.0 |  | 15293.019 |  |
| 423.5 |  | 15303.311 |  |
| 423.0 |  | 15313.598 |  |
| 422.5 |  | 15323.878 |  |
| 422.0 |  | 15334.153 |  |
| 421.5 |  | 15344.421 |  |
| 421.0 |  | 15354.683 |  |
| 420.5 |  | 15364.939 |  |
| 420.0 |  | 15375.189 |  |
| 419.5 |  | 15385.433 |  |
| 419.0 |  | 15395.671 |  |
| 418.5 |  | 15405.903 |  |
| 418.0 |  | 15416.128 |  |
| 417.5 |  | 15426.348 |  |
| 417.0 |  | 15436.561 |  |
| 416.5 |  | 15446.768 |  |
| 416.0 |  | 15456.969 |  |
| 415.5 |  | 15467.164 |  |
| 415.0 |  | 15477.353 |  |
| 414.5 |  | 15487.536 |  |
| 414.0 |  | 15497.713 |  |
| 413.5 |  | 15507.883 |  |
| 413.0 |  | 15518.047 |  |
| 412.5 |  | 15528.205 |  |
| 412.0 |  | 15538.357 |  |
| 411.5 |  | 15548.503 |  |
| 411.0 |  | 15558.643 |  |
| 410.5 |  | 15568.776 |  |
| 410.0 |  | 15578.904 |  |
| 409.5 |  | 15589.025 |  |
| 409.0 |  | 15599.14 |  |
| 408.5 |  | 15609.248 |  |
| 408.0 |  | 15619.351 |  |
| 407.5 |  | 15629.447 |  |
| 407.0 |  | 15639.538 |  |
| 406.5 |  | 15649.622 |  |
| 406.0 |  | 15659.7 |  |
| 405.5 |  | 15669.771 |  |
| 405.0 |  | 15679.837 |  |
| 404.5 |  | 15689.896 |  |
| 404.0 |  | 15699.949 |  |
| 403.5 |  | 15709.996 |  |
| 403.0 |  | 15720.036 |  |
| 402.5 |  | 15730.07 |  |
| 402.0 |  | 15740.098 |  |
| 401.5 |  | 15750.12 |  |
| 401.0 |  | 15760.136 |  |
| 400.5 |  | 15770.145 |  |
| 400.0 |  | 15780.148 |  |
| 399.5 |  | 15790.145 |  |
| 399.0 |  | 15800.136 |  |
| 398.5 |  | 15810.12 |  |
| 398.0 |  | 15820.098 |  |
| 397.5 |  | 15830.07 |  |
| 397.0 |  | 15840.036 |  |
| 396.5 |  | 15849.995 |  |
| 396.0 |  | 15859.948 |  |
| 395.5 |  | 15869.895 |  |
| 395.0 |  | 15879.835 |  |
| 394.5 |  | 15889.769 |  |
| 394.0 |  | 15899.697 |  |
| 393.5 |  | 15909.619 |  |
| 393.0 |  | 15919.534 |  |
| 392.5 |  | 15929.443 |  |
| 392.0 |  | 15939.346 |  |
| 391.5 |  | 15949.242 |  |
| 391.0 |  | 15959.132 |  |
| 390.5 |  | 15969.016 |  |
| 390.0 |  | 15978.893 |  |
| 389.5 |  | 15988.764 |  |
| 389.0 |  | 15998.629 |  |
| 388.5 |  | 16008.487 |  |
| 388.0 |  | 16018.339 |  |
| 387.5 |  | 16028.185 |  |
| 387.0 |  | 16038.024 |  |
| 386.5 |  | 16047.857 |  |
| 386.0 |  | 16057.684 |  |
| 385.5 |  | 16067.504 |  |
| 385.0 |  | 16077.318 |  |
| 384.5 |  | 16087.126 |  |
| 384.0 |  | 16096.927 |  |
| 383.5 |  | 16106.722 |  |
| 383.0 |  | 16116.51 |  |
| 382.5 |  | 16126.292 |  |
| 382.0 |  | 16136.068 |  |
| 381.5 |  | 16145.837 |  |
| 381.0 |  | 16155.6 |  |
| 380.5 |  | 16165.356 |  |
| 380.0 |  | 16175.106 |  |
| 379.5 |  | 16184.85 |  |
| 379.0 |  | 16194.587 |  |
| 378.5 |  | 16204.317 |  |
| 378.0 |  | 16214.042 |  |
| 377.5 |  | 16223.76 |  |
| 377.0 |  | 16233.471 |  |
| 376.5 |  | 16243.176 |  |
| 376.0 |  | 16252.875 |  |
| 375.5 |  | 16262.567 |  |
| 375.0 |  | 16272.253 |  |
| 374.5 |  | 16281.932 |  |
| 374.0 |  | 16291.605 |  |
| 373.5 |  | 16301.271 |  |
| 373.0 |  | 16310.931 |  |
| 372.5 |  | 16320.584 |  |
| 372.0 |  | 16330.231 |  |
| 371.5 |  | 16339.871 |  |
| 371.0 |  | 16349.505 |  |
| 370.5 |  | 16359.133 |  |
| 370.0 |  | 16368.754 |  |
| 369.5 |  | 16378.368 |  |
| 369.0 |  | 16387.976 |  |
| 368.5 |  | 16397.577 |  |
| 368.0 |  | 16407.172 |  |
| 367.5 |  | 16416.761 |  |
| 367.0 |  | 16426.343 |  |
| 366.5 |  | 16435.918 |  |
| 366.0 |  | 16445.487 |  |
| 365.5 |  | 16455.049 |  |
| 365.0 |  | 16464.605 |  |
| 364.5 |  | 16474.154 |  |
| 364.0 |  | 16483.697 |  |
| 363.5 |  | 16493.233 |  |
| 363.0 |  | 16502.762 |  |
| 362.5 |  | 16512.285 |  |
| 362.0 |  | 16521.802 |  |
| 361.5 |  | 16531.312 |  |
| 361.0 |  | 16540.815 |  |
| 360.5 |  | 16550.312 |  |
| 360.0 |  | 16559.802 |  |
| 359.5 |  | 16569.285 |  |
| 359.0 |  | 16578.762 |  |
| 358.5 |  | 16588.233 |  |
| 358.0 |  | 16597.696 |  |
| 357.5 |  | 16607.154 |  |
| 357.0 |  | 16616.604 |  |
| 356.5 |  | 16626.048 |  |
| 356.0 |  | 16635.485 |  |
| 355.5 |  | 16644.916 |  |
| 355.0 |  | 16654.34 |  |
| 354.5 |  | 16663.757 |  |
| 354.0 |  | 16673.168 |  |
| 353.5 |  | 16682.572 |  |
| 353.0 |  | 16691.97 |  |
| 352.5 |  | 16701.361 |  |
| 352.0 |  | 16710.745 |  |
| 351.5 |  | 16720.122 |  |
| 351.0 |  | 16729.493 |  |
| 350.5 |  | 16738.857 |  |
| 350.0 |  | 16748.215 |  |
| 349.5 |  | 16757.566 |  |
| 349.0 |  | 16766.91 |  |
| 348.5 |  | 16776.247 |  |
| 348.0 |  | 16785.578 |  |
| 347.5 |  | 16794.902 |  |
| 347.0 |  | 16804.219 |  |
| 346.5 |  | 16813.53 |  |
| 346.0 |  | 16822.834 |  |
| 345.5 |  | 16832.131 |  |
| 345.0 |  | 16841.421 |  |
| 344.5 |  | 16850.705 |  |
| 344.0 |  | 16859.982 |  |
| 343.5 |  | 16869.252 |  |
| 343.0 |  | 16878.516 |  |
| 342.5 |  | 16887.773 |  |
| 342.0 |  | 16897.023 |  |
| 341.5 |  | 16906.266 |  |
| 341.0 |  | 16915.502 |  |
| 340.5 |  | 16924.732 |  |
| 340.0 |  | 16933.955 |  |
| 339.5 |  | 16943.171 |  |
| 339.0 |  | 16952.38 |  |
| 338.5 |  | 16961.583 |  |
| 338.0 |  | 16970.779 |  |
| 337.5 |  | 16979.968 |  |
| 337.0 |  | 16989.15 |  |
| 336.5 |  | 16998.325 |  |
| 336.0 |  | 17007.494 |  |
| 335.5 |  | 17016.656 |  |
| 335.0 |  | 17025.811 |  |
| 334.5 |  | 17034.959 |  |
| 334.0 |  | 17044.1 |  |
| 333.5 |  | 17053.234 |  |
| 333.0 |  | 17062.362 |  |
| 332.5 |  | 17071.483 |  |
| 332.0 |  | 17080.596 |  |
| 331.5 |  | 17089.703 |  |
| 331.0 |  | 17098.804 |  |
| 330.5 |  | 17107.897 |  |
| 330.0 |  | 17116.983 |  |
| 329.5 |  | 17126.063 |  |
| 329.0 |  | 17135.135 |  |
| 328.5 |  | 17144.201 |  |
| 328.0 |  | 17153.26 |  |
| 327.5 |  | 17162.312 |  |
| 327.0 |  | 17171.357 |  |
| 326.5 |  | 17180.395 |  |
| 326.0 |  | 17189.426 |  |
| 325.5 |  | 17198.451 |  |
| 325.0 |  | 17207.468 |  |
| 324.5 |  | 17216.478 |  |
| 324.0 |  | 17225.482 |  |
| 323.5 |  | 17234.478 |  |
| 323.0 |  | 17243.468 |  |
| 322.5 |  | 17252.45 |  |
| 322.0 |  | 17261.426 |  |
| 321.5 |  | 17270.395 |  |
| 321.0 |  | 17279.357 |  |
| 320.5 |  | 17288.311 |  |
| 320.0 |  | 17297.259 |  |
| 319.5 |  | 17306.2 |  |
| 319.0 |  | 17315.134 |  |
| 318.5 |  | 17324.06 |  |
| 318.0 |  | 17332.98 |  |
| 317.5 |  | 17341.893 |  |
| 317.0 |  | 17350.799 |  |
| 316.5 |  | 17359.697 |  |
| 316.0 |  | 17368.589 |  |
| 315.5 |  | 17377.474 |  |
| 315.0 |  | 17386.351 |  |
| 314.5 |  | 17395.222 |  |
| 314.0 |  | 17404.086 |  |
| 313.5 |  | 17412.942 |  |
| 313.0 |  | 17421.792 |  |
| 312.5 |  | 17430.634 |  |
| 312.0 |  | 17439.469 |  |
| 311.5 |  | 17448.297 |  |
| 311.0 |  | 17457.119 |  |
| 310.5 |  | 17465.933 |  |
| 310.0 |  | 17474.74 |  |
| 309.5 |  | 17483.539 |  |
| 309.0 |  | 17492.332 |  |
| 308.5 |  | 17501.118 |  |
| 308.0 |  | 17509.896 |  |
| 307.5 |  | 17518.668 |  |
| 307.0 |  | 17527.432 |  |
| 306.5 |  | 17536.189 |  |
| 306.0 |  | 17544.939 |  |
| 305.5 |  | 17553.682 |  |
| 305.0 |  | 17562.418 |  |
| 304.5 |  | 17571.146 |  |
| 304.0 |  | 17579.868 |  |
| 303.5 |  | 17588.582 |  |
| 303.0 |  | 17597.289 |  |
| 302.5 |  | 17605.989 |  |
| 302.0 |  | 17614.681 |  |
| 301.5 |  | 17623.367 |  |
| 301.0 |  | 17632.045 |  |
| 300.5 |  | 17640.716 |  |
| 300.0 |  | 17649.38 |  |
| 299.5 |  | 17658.037 |  |
| 299.0 |  | 17666.686 |  |
| 298.5 |  | 17675.328 |  |
| 298.0 |  | 17683.963 |  |
| 297.5 |  | 17692.591 |  |
| 297.0 |  | 17701.212 |  |
| 296.5 |  | 17709.825 |  |
| 296.0 |  | 17718.431 |  |
| 295.5 |  | 17727.029 |  |
| 295.0 |  | 17735.621 |  |
| 294.5 |  | 17744.205 |  |
| 294.0 |  | 17752.782 |  |
| 293.5 |  | 17761.351 |  |
| 293.0 |  | 17769.914 |  |
| 292.5 |  | 17778.469 |  |
| 292.0 |  | 17787.016 |  |
| 291.5 |  | 17795.557 |  |
| 291.0 |  | 17804.09 |  |
| 290.5 |  | 17812.615 |  |
| 290.0 |  | 17821.134 |  |
| 289.5 |  | 17829.645 |  |
| 289.0 |  | 17838.148 |  |
| 288.5 |  | 17846.645 |  |
| 288.0 |  | 17855.134 |  |
| 287.5 |  | 17863.615 |  |
| 287.0 |  | 17872.09 |  |
| 286.5 |  | 17880.556 |  |
| 286.0 |  | 17889.016 |  |
| 285.5 |  | 17897.468 |  |
| 285.0 |  | 17905.913 |  |
| 284.5 |  | 17914.35 |  |
| 284.0 |  | 17922.78 |  |
| 283.5 |  | 17931.202 |  |
| 283.0 |  | 17939.617 |  |
| 282.5 |  | 17948.025 |  |
| 282.0 |  | 17956.425 |  |
| 281.5 |  | 17964.818 |  |
| 281.0 |  | 17973.203 |  |
| 280.5 |  | 17981.581 |  |
| 280.0 |  | 17989.951 |  |
| 279.5 |  | 17998.314 |  |
| 279.0 |  | 18006.669 |  |
| 278.5 |  | 18015.017 |  |
| 278.0 |  | 18023.358 |  |
| 277.5 |  | 18031.69 |  |
| 277.0 |  | 18040.016 |  |
| 276.5 |  | 18048.334 |  |
| 276.0 |  | 18056.644 |  |
| 275.5 |  | 18064.947 |  |
| 275.0 |  | 18073.242 |  |
| 274.5 |  | 18081.53 |  |
| 274.0 |  | 18089.81 |  |
| 273.5 |  | 18098.083 |  |
| 273.0 |  | 18106.348 |  |
| 272.5 |  | 18114.606 |  |
| 272.0 |  | 18122.856 |  |
| 271.5 |  | 18131.098 |  |
| 271.0 |  | 18139.333 |  |
| 270.5 |  | 18147.56 |  |
| 270.0 |  | 18155.78 |  |
| 269.5 |  | 18163.992 |  |
| 269.0 |  | 18172.196 |  |
| 268.5 |  | 18180.393 |  |
| 268.0 |  | 18188.582 |  |
| 267.5 |  | 18196.764 |  |
| 267.0 |  | 18204.938 |  |
| 266.5 |  | 18213.104 |  |
| 266.0 |  | 18221.263 |  |
| 265.5 |  | 18229.414 |  |
| 265.0 |  | 18237.557 |  |
| 264.5 |  | 18245.692 |  |
| 264.0 |  | 18253.82 |  |
| 263.5 |  | 18261.94 |  |
| 263.0 |  | 18270.053 |  |
| 262.5 |  | 18278.158 |  |
| 262.0 |  | 18286.255 |  |
| 261.5 |  | 18294.344 |  |
| 261.0 |  | 18302.426 |  |
| 260.5 |  | 18310.5 |  |
| 260.0 |  | 18318.566 |  |
| 259.5 |  | 18326.624 |  |
| 259.0 |  | 18334.675 |  |
| 258.5 |  | 18342.718 |  |
| 258.0 |  | 18350.753 |  |
| 257.5 |  | 18358.78 |  |
| 257.0 |  | 18366.799 |  |
| 256.5 |  | 18374.811 |  |
| 256.0 |  | 18382.815 |  |
| 255.5 |  | 18390.811 |  |
| 255.0 |  | 18398.799 |  |
| 254.5 |  | 18406.78 |  |
| 254.0 |  | 18414.753 |  |
| 253.5 |  | 18422.717 |  |
| 253.0 |  | 18430.674 |  |
| 252.5 |  | 18438.623 |  |
| 252.0 |  | 18446.564 |  |
| 251.5 |  | 18454.498 |  |
| 251.0 |  | 18462.423 |  |
| 250.5 |  | 18470.341 |  |
| 250.0 |  | 18478.25 |  |
| 249.5 |  | 18486.152 |  |
| 249.0 |  | 18494.046 |  |
| 248.5 |  | 18501.932 |  |
| 248.0 |  | 18509.81 |  |
| 247.5 |  | 18517.68 |  |
| 247.0 |  | 18525.542 |  |
| 246.5 |  | 18533.396 |  |
| 246.0 |  | 18541.242 |  |
| 245.5 |  | 18549.08 |  |
| 245.0 |  | 18556.911 |  |
| 244.5 |  | 18564.733 |  |
| 244.0 |  | 18572.547 |  |
| 243.5 |  | 18580.353 |  |
| 243.0 |  | 18588.152 |  |
| 242.5 |  | 18595.942 |  |
| 242.0 |  | 18603.724 |  |
| 241.5 |  | 18611.498 |  |
| 241.0 |  | 18619.264 |  |
| 240.5 |  | 18627.022 |  |
| 240.0 |  | 18634.772 |  |
| 239.5 |  | 18642.514 |  |
| 239.0 |  | 18650.248 |  |
| 238.5 |  | 18657.974 |  |
| 238.0 |  | 18665.692 |  |
| 237.5 |  | 18673.401 |  |
| 237.0 |  | 18681.103 |  |
| 236.5 |  | 18688.796 |  |
| 236.0 |  | 18696.481 |  |
| 235.5 |  | 18704.158 |  |
| 235.0 |  | 18711.827 |  |
| 234.5 |  | 18719.488 |  |
| 234.0 |  | 18727.141 |  |
| 233.5 |  | 18734.785 |  |
| 233.0 |  | 18742.421 |  |
| 232.5 |  | 18750.049 |  |
| 232.0 |  | 18757.669 |  |
| 231.5 |  | 18765.281 |  |
| 231.0 |  | 18772.884 |  |
| 230.5 |  | 18780.48 |  |
| 230.0 |  | 18788.067 |  |
| 229.5 |  | 18795.645 |  |
| 229.0 |  | 18803.216 |  |
| 228.5 |  | 18810.778 |  |
| 228.0 |  | 18818.332 |  |
| 227.5 |  | 18825.878 |  |
| 227.0 |  | 18833.415 |  |
| 226.5 |  | 18840.944 |  |
| 226.0 |  | 18848.465 |  |
| 225.5 |  | 18855.978 |  |
| 225.0 |  | 18863.482 |  |
| 224.5 |  | 18870.978 |  |
| 224.0 |  | 18878.465 |  |
| 223.5 |  | 18885.944 |  |
| 223.0 |  | 18893.415 |  |
| 222.5 |  | 18900.877 |  |
| 222.0 |  | 18908.331 |  |
| 221.5 |  | 18915.777 |  |
| 221.0 |  | 18923.214 |  |
| 220.5 |  | 18930.643 |  |
| 220.0 |  | 18938.064 |  |
| 219.5 |  | 18945.476 |  |
| 219.0 |  | 18952.879 |  |
| 218.5 |  | 18960.274 |  |
| 218.0 |  | 18967.661 |  |
| 217.5 |  | 18975.039 |  |
| 217.0 |  | 18982.409 |  |
| 216.5 |  | 18989.77 |  |
| 216.0 |  | 18997.123 |  |
| 215.5 |  | 19004.467 |  |
| 215.0 |  | 19011.803 |  |
| 214.5 |  | 19019.13 |  |
| 214.0 |  | 19026.448 |  |
| 213.5 |  | 19033.758 |  |
| 213.0 |  | 19041.06 |  |
| 212.5 |  | 19048.353 |  |
| 212.0 |  | 19055.637 |  |
| 211.5 |  | 19062.913 |  |
| 211.0 |  | 19070.18 |  |
| 210.5 |  | 19077.439 |  |
| 210.0 |  | 19084.689 |  |
| 209.5 |  | 19091.93 |  |
| 209.0 |  | 19099.163 |  |
| 208.5 |  | 19106.387 |  |
| 208.0 |  | 19113.603 |  |
| 207.5 |  | 19120.809 |  |
| 207.0 |  | 19128.007 |  |
| 206.5 |  | 19135.197 |  |
| 206.0 |  | 19142.378 |  |
| 205.5 |  | 19149.55 |  |
| 205.0 |  | 19156.713 |  |
| 204.5 |  | 19163.867 |  |
| 204.0 |  | 19171.013 |  |
| 203.5 |  | 19178.15 |  |
| 203.0 |  | 19185.279 |  |
| 202.5 |  | 19192.398 |  |
| 202.0 |  | 19199.509 |  |
| 201.5 |  | 19206.611 |  |
| 201.0 |  | 19213.704 |  |
| 200.5 |  | 19220.788 |  |
| 200.0 |  | 19227.864 |  |
| 199.5 |  | 19234.93 |  |
| 199.0 |  | 19241.988 |  |
| 198.5 |  | 19249.037 |  |
| 198.0 |  | 19256.077 |  |
| 197.5 |  | 19263.108 |  |
| 197.0 |  | 19270.131 |  |
| 196.5 |  | 19277.144 |  |
| 196.0 |  | 19284.148 |  |
| 195.5 |  | 19291.144 |  |
| 195.0 |  | 19298.131 |  |
| 194.5 |  | 19305.108 |  |
| 194.0 |  | 19312.077 |  |
| 193.5 |  | 19319.037 |  |
| 193.0 |  | 19325.987 |  |
| 192.5 |  | 19332.929 |  |
| 192.0 |  | 19339.862 |  |
| 191.5 |  | 19346.785 |  |
| 191.0 |  | 19353.7 |  |
| 190.5 |  | 19360.606 |  |
| 190.0 |  | 19367.502 |  |
| 189.5 |  | 19374.39 |  |
| 189.0 |  | 19381.268 |  |
| 188.5 |  | 19388.137 |  |
| 188.0 |  | 19394.998 |  |
| 187.5 |  | 19401.849 |  |
| 187.0 |  | 19408.691 |  |
| 186.5 |  | 19415.524 |  |
| 186.0 |  | 19422.347 |  |
| 185.5 |  | 19429.162 |  |
| 185.0 |  | 19435.967 |  |
| 184.5 |  | 19442.763 |  |
| 184.0 |  | 19449.55 |  |
| 183.5 |  | 19456.328 |  |
| 183.0 |  | 19463.096 |  |
| 182.5 |  | 19469.856 |  |
| 182.0 |  | 19476.606 |  |
| 181.5 |  | 19483.346 |  |
| 181.0 |  | 19490.078 |  |
| 180.5 |  | 19496.8 |  |
| 180.0 |  | 19503.513 |  |
| 179.5 |  | 19510.216 |  |
| 179.0 |  | 19516.911 |  |
| 178.5 |  | 19523.595 |  |
| 178.0 |  | 19530.271 |  |
| 177.5 |  | 19536.937 |  |
| 177.0 |  | 19543.594 |  |
| 176.5 |  | 19550.241 |  |
| 176.0 |  | 19556.879 |  |
| 175.5 |  | 19563.508 |  |
| 175.0 |  | 19570.127 |  |
| 174.5 |  | 19576.736 |  |
| 174.0 |  | 19583.337 |  |
| 173.5 |  | 19589.927 |  |
| 173.0 |  | 19596.509 |  |
| 172.5 |  | 19603.08 |  |
| 172.0 |  | 19609.643 |  |
| 171.5 |  | 19616.195 |  |
| 171.0 |  | 19622.738 |  |
| 170.5 |  | 19629.272 |  |
| 170.0 |  | 19635.796 |  |
| 169.5 |  | 19642.31 |  |
| 169.0 |  | 19648.815 |  |
| 168.5 |  | 19655.31 |  |
| 168.0 |  | 19661.796 |  |
| 167.5 |  | 19668.272 |  |
| 167.0 |  | 19674.738 |  |
| 166.5 |  | 19681.195 |  |
| 166.0 |  | 19687.641 |  |
| 165.5 |  | 19694.079 |  |
| 165.0 |  | 19700.506 |  |
| 164.5 |  | 19706.924 |  |
| 164.0 |  | 19713.332 |  |
| 163.5 |  | 19719.73 |  |
| 163.0 |  | 19726.119 |  |
| 162.5 |  | 19732.497 |  |
| 162.0 |  | 19738.866 |  |
| 161.5 |  | 19745.225 |  |
| 161.0 |  | 19751.574 |  |
| 160.5 |  | 19757.914 |  |
| 160.0 |  | 19764.243 |  |
| 159.5 |  | 19770.563 |  |
| 159.0 |  | 19776.873 |  |
| 158.5 |  | 19783.172 |  |
| 158.0 |  | 19789.462 |  |
| 157.5 |  | 19795.742 |  |
| 157.0 |  | 19802.012 |  |
| 156.5 |  | 19808.272 |  |
| 156.0 |  | 19814.522 |  |
| 155.5 |  | 19820.762 |  |
| 155.0 |  | 19826.992 |  |
| 154.5 |  | 19833.212 |  |
| 154.0 |  | 19839.422 |  |
| 153.5 |  | 19845.622 |  |
| 153.0 |  | 19851.811 |  |
| 152.5 |  | 19857.991 |  |
| 152.0 |  | 19864.161 |  |
| 151.5 |  | 19870.32 |  |
| 151.0 |  | 19876.469 |  |
| 150.5 |  | 19882.608 |  |
| 150.0 |  | 19888.737 |  |
| 149.5 |  | 19894.855 |  |
| 149.0 |  | 19900.964 |  |
| 148.5 |  | 19907.062 |  |
| 148.0 |  | 19913.15 |  |
| 147.5 |  | 19919.228 |  |
| 147.0 |  | 19925.295 |  |
| 146.5 |  | 19931.352 |  |
| 146.0 |  | 19937.399 |  |
| 145.5 |  | 19943.435 |  |
| 145.0 |  | 19949.461 |  |
| 144.5 |  | 19955.477 |  |
| 144.0 |  | 19961.482 |  |
| 143.5 |  | 19967.477 |  |
| 143.0 |  | 19973.461 |  |
| 142.5 |  | 19979.435 |  |
| 142.0 |  | 19985.398 |  |
| 141.5 |  | 19991.351 |  |
| 141.0 |  | 19997.294 |  |
| 140.5 |  | 20003.225 |  |
| 140.0 |  | 20009.147 |  |
| 139.5 |  | 20015.058 |  |
| 139.0 |  | 20020.958 |  |
| 138.5 |  | 20026.847 |  |
| 138.0 |  | 20032.726 |  |
| 137.5 |  | 20038.595 |  |
| 137.0 |  | 20044.452 |  |
| 136.5 |  | 20050.299 |  |
| 136.0 |  | 20056.136 |  |
| 135.5 |  | 20061.961 |  |
| 135.0 |  | 20067.776 |  |
| 134.5 |  | 20073.58 |  |
| 134.0 |  | 20079.374 |  |
| 133.5 |  | 20085.156 |  |
| 133.0 |  | 20090.928 |  |
| 132.5 |  | 20096.689 |  |
| 132.0 |  | 20102.439 |  |
| 131.5 |  | 20108.178 |  |
| 131.0 |  | 20113.906 |  |
| 130.5 |  | 20119.623 |  |
| 130.0 |  | 20125.33 |  |
| 129.5 |  | 20131.025 |  |
| 129.0 |  | 20136.71 |  |
| 128.5 |  | 20142.383 |  |
| 128.0 |  | 20148.045 |  |
| 127.5 |  | 20153.697 |  |
| 127.0 |  | 20159.337 |  |
| 126.5 |  | 20164.966 |  |
| 126.0 |  | 20170.584 |  |
| 125.5 |  | 20176.191 |  |
| 125.0 |  | 20181.787 |  |
| 124.5 |  | 20187.371 |  |
| 124.0 |  | 20192.945 |  |
| 123.5 |  | 20198.507 |  |
| 123.0 |  | 20204.058 |  |
| 122.5 |  | 20209.597 |  |
| 122.0 |  | 20215.126 |  |
| 121.5 |  | 20220.643 |  |
| 121.0 |  | 20226.148 |  |
| 120.5 |  | 20231.643 |  |
| 120.0 |  | 20237.126 |  |
| 119.5 |  | 20242.597 |  |
| 119.0 |  | 20248.057 |  |
| 118.5 |  | 20253.506 |  |
| 118.0 |  | 20258.943 |  |
| 117.5 |  | 20264.369 |  |
| 117.0 |  | 20269.783 |  |
| 116.5 |  | 20275.185 |  |
| 116.0 |  | 20280.576 |  |
| 115.5 |  | 20285.956 |  |
| 115.0 |  | 20291.323 |  |
| 114.5 |  | 20296.679 |  |
| 114.0 |  | 20302.024 |  |
| 113.5 |  | 20307.356 |  |
| 113.0 |  | 20312.677 |  |
| 112.5 |  | 20317.987 |  |
| 112.0 |  | 20323.284 |  |
| 111.5 |  | 20328.57 |  |
| 111.0 |  | 20333.843 |  |
| 110.5 |  | 20339.105 |  |
| 110.0 |  | 20344.355 |  |
| 109.5 |  | 20349.593 |  |
| 109.0 |  | 20354.819 |  |
| 108.5 |  | 20360.034 |  |
| 108.0 |  | 20365.236 |  |
| 107.5 |  | 20370.426 |  |
| 107.0 |  | 20375.604 |  |
| 106.5 |  | 20380.77 |  |
| 106.0 |  | 20385.924 |  |
| 105.5 |  | 20391.066 |  |
| 105.0 |  | 20396.195 |  |
| 104.5 |  | 20401.313 |  |
| 104.0 |  | 20406.418 |  |
| 103.5 |  | 20411.511 |  |
| 103.0 |  | 20416.591 |  |
| 102.5 |  | 20421.659 |  |
| 102.0 |  | 20426.715 |  |
| 101.5 |  | 20431.759 |  |
| 101.0 |  | 20436.79 |  |
| 100.5 |  | 20441.809 |  |
| 100.0 |  | 20446.815 |  |
| 99.5 |  | 20451.809 |  |
| 99.0 |  | 20456.79 |  |
| 98.5 |  | 20461.759 |  |
| 98.0 |  | 20466.715 |  |
| 97.5 |  | 20471.658 |  |
| 97.0 |  | 20476.589 |  |
| 96.5 |  | 20481.507 |  |
| 96.0 |  | 20486.412 |  |
| 95.5 |  | 20491.305 |  |
| 95.0 |  | 20496.185 |  |
| 94.5 |  | 20501.052 |  |
| 94.0 |  | 20505.906 |  |
| 93.5 |  | 20510.747 |  |
| 93.0 |  | 20515.575 |  |
| 92.5 |  | 20520.391 |  |
| 92.0 |  | 20525.193 |  |
| 91.5 |  | 20529.982 |  |
| 91.0 |  | 20534.759 |  |
| 90.5 |  | 20539.522 |  |
| 90.0 |  | 20544.272 |  |
| 89.5 |  | 20549.009 |  |
| 89.0 |  | 20553.732 |  |
| 88.5 |  | 20558.443 |  |
| 88.0 |  | 20563.14 |  |
| 87.5 |  | 20567.823 |  |
| 87.0 |  | 20572.494 |  |
| 86.5 |  | 20577.151 |  |
| 86.0 |  | 20581.794 |  |
| 85.5 |  | 20586.424 |  |
| 85.0 |  | 20591.041 |  |
| 84.5 |  | 20595.644 |  |
| 84.0 |  | 20600.233 |  |
| 83.5 |  | 20604.809 |  |
| 83.0 |  | 20609.371 |  |
| 82.5 |  | 20613.919 |  |
| 82.0 |  | 20618.454 |  |
| 81.5 |  | 20622.975 |  |
| 81.0 |  | 20627.482 |  |
| 80.5 |  | 20631.975 |  |
| 80.0 |  | 20636.454 |  |
| 79.5 |  | 20640.919 |  |
| 79.0 |  | 20645.37 |  |
| 78.5 |  | 20649.807 |  |
| 78.0 |  | 20654.23 |  |
| 77.5 |  | 20658.639 |  |
| 77.0 |  | 20663.034 |  |
| 76.5 |  | 20667.414 |  |
| 76.0 |  | 20671.78 |  |
| 75.5 |  | 20676.132 |  |
| 75.0 |  | 20680.469 |  |
| 74.5 |  | 20684.792 |  |
| 74.0 |  | 20689.1 |  |
| 73.5 |  | 20693.394 |  |
| 73.0 |  | 20697.674 |  |
| 72.5 |  | 20701.938 |  |
| 72.0 |  | 20706.188 |  |
| 71.5 |  | 20710.424 |  |
| 71.0 |  | 20714.644 |  |
| 70.5 |  | 20718.85 |  |
| 70.0 |  | 20723.04 |  |
| 69.5 |  | 20727.216 |  |
| 69.0 |  | 20731.377 |  |
| 68.5 |  | 20735.523 |  |
| 68.0 |  | 20739.654 |  |
| 67.5 |  | 20743.769 |  |
| 67.0 |  | 20747.869 |  |
| 66.5 |  | 20751.954 |  |
| 66.0 |  | 20756.024 |  |
| 65.5 |  | 20760.078 |  |
| 65.0 |  | 20764.117 |  |
| 64.5 |  | 20768.141 |  |
| 64.0 |  | 20772.148 |  |
| 63.5 |  | 20776.141 |  |
| 63.0 |  | 20780.117 |  |
| 62.5 |  | 20784.078 |  |
| 62.0 |  | 20788.023 |  |
| 61.5 |  | 20791.952 |  |
| 61.0 |  | 20795.865 |  |
| 60.5 |  | 20799.762 |  |
| 60.0 |  | 20803.643 |  |
| 59.5 |  | 20807.508 |  |
| 59.0 |  | 20811.357 |  |
| 58.5 |  | 20815.189 |  |
| 58.0 |  | 20819.005 |  |
| 57.5 |  | 20822.805 |  |
| 57.0 |  | 20826.588 |  |
| 56.5 |  | 20830.355 |  |
| 56.0 |  | 20834.105 |  |
| 55.5 |  | 20837.838 |  |
| 55.0 |  | 20841.554 |  |
| 54.5 |  | 20845.254 |  |
| 54.0 |  | 20848.937 |  |
| 53.5 |  | 20852.603 |  |
| 53.0 |  | 20856.251 |  |
| 52.5 |  | 20859.883 |  |
| 52.0 |  | 20863.497 |  |
| 51.5 |  | 20867.094 |  |
| 51.0 |  | 20870.673 |  |
| 50.5 |  | 20874.235 |  |
| 50.0 |  | 20877.779 |  |
| 49.5 |  | 20881.306 |  |
| 49.0 |  | 20884.815 |  |
| 48.5 |  | 20888.306 |  |
| 48.0 |  | 20891.779 |  |
| 47.5 |  | 20895.234 |  |
| 47.0 |  | 20898.671 |  |
| 46.5 |  | 20902.09 |  |
| 46.0 |  | 20905.49 |  |
| 45.5 |  | 20908.872 |  |
| 45.0 |  | 20912.236 |  |
| 44.5 |  | 20915.58 |  |
| 44.0 |  | 20918.906 |  |
| 43.5 |  | 20922.214 |  |
| 43.0 |  | 20925.502 |  |
| 42.5 |  | 20928.771 |  |
| 42.0 |  | 20932.021 |  |
| 41.5 |  | 20935.252 |  |
| 41.0 |  | 20938.463 |  |
| 40.5 |  | 20941.655 |  |
| 40.0 |  | 20944.827 |  |
| 39.5 |  | 20947.979 |  |
| 39.0 |  | 20951.112 |  |
| 38.5 |  | 20954.224 |  |
| 38.0 |  | 20957.317 |  |
| 37.5 |  | 20960.389 |  |
| 37.0 |  | 20963.44 |  |
| 36.5 |  | 20966.471 |  |
| 36.0 |  | 20969.482 |  |
| 35.5 |  | 20972.471 |  |
| 35.0 |  | 20975.44 |  |
| 34.5 |  | 20978.387 |  |
| 34.0 |  | 20981.314 |  |
| 33.5 |  | 20984.218 |  |
| 33.0 |  | 20987.101 |  |
| 32.5 |  | 20989.963 |  |
| 32.0 |  | 20992.802 |  |
| 31.5 |  | 20995.62 |  |
| 31.0 |  | 20998.415 |  |
| 30.5 |  | 21001.187 |  |
| 30.0 |  | 21003.937 |  |
| 29.5 |  | 21006.664 |  |
| 29.0 |  | 21009.369 |  |
| 28.5 |  | 21012.05 |  |
| 28.0 |  | 21014.707 |  |
| 27.5 |  | 21017.341 |  |
| 27.0 |  | 21019.951 |  |
| 26.5 |  | 21022.537 |  |
| 26.0 |  | 21025.099 |  |
| 25.5 |  | 21027.636 |  |
| 25.0 |  | 21030.148 |  |
| 24.5 |  | 21032.636 |  |
| 24.0 |  | 21035.098 |  |
| 23.5 |  | 21037.535 |  |
| 23.0 |  | 21039.946 |  |
| 22.5 |  | 21042.331 |  |
| 22.0 |  | 21044.689 |  |
| 21.5 |  | 21047.021 |  |
| 21.0 |  | 21049.326 |  |
| 20.5 |  | 21051.603 |  |
| 20.0 |  | 21053.853 |  |
| 19.5 |  | 21056.075 |  |
| 19.0 |  | 21058.269 |  |
| 18.5 |  | 21060.434 |  |
| 18.0 |  | 21062.57 |  |
| 17.5 |  | 21064.677 |  |
| 17.0 |  | 21066.753 |  |
| 16.5 |  | 21068.8 |  |
| 16.0 |  | 21070.815 |  |
| 15.5 |  | 21072.799 |  |
| 15.0 |  | 21074.752 |  |
| 14.5 |  | 21076.672 |  |
| 14.0 |  | 21078.56 |  |
| 13.5 |  | 21080.414 |  |
| 13.0 |  | 21082.234 |  |
| 12.5 |  | 21084.019 |  |
| 12.0 |  | 21085.769 |  |
| 11.5 |  | 21087.483 |  |
| 11.0 |  | 21089.16 |  |
| 10.5 |  | 21090.799 |  |
| 10.0 |  | 21092.4 |  |
| 9.5 |  | 21093.961 |  |
| 9.0 |  | 21095.482 |  |
| 8.5 |  | 21096.961 |  |
| 8.0 |  | 21098.397 |  |
| 7.5 |  | 21099.789 |  |
| 7.0 |  | 21101.135 |  |
| 6.5 |  | 21102.434 |  |
| 6.0 |  | 21103.684 |  |
| 5.5 |  | 21104.883 |  |
| 5.0 |  | 21106.028 |  |
| 4.5 |  | 21107.118 |  |
| 4.0 |  | 21108.148 |  |
| 3.5 |  | 21109.116 |  |
| 3.0 |  | 21110.018 |  |
| 2.5 |  | 21110.847 |  |
| 2.0 |  | 21111.596 |  |
| 1.5 |  | 21112.257 |  |
| 1.0 |  | 21112.815 |  |